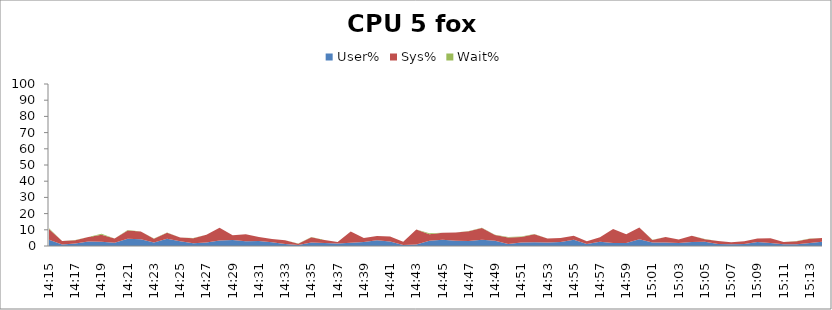
| Category | User% | Sys% | Wait% |
|---|---|---|---|
| 14:15 | 3.8 | 6.7 | 0.4 |
| 14:16 | 0.9 | 2.2 | 0 |
| 14:17 | 1.5 | 2.1 | 0.1 |
| 14:18 | 2.8 | 2.7 | 0 |
| 14:19 | 2.7 | 4.3 | 0.6 |
| 14:20 | 2 | 2.6 | 0 |
| 14:21 | 4.5 | 5.1 | 0.2 |
| 14:22 | 4.2 | 4.8 | 0 |
| 14:23 | 2.2 | 2.3 | 0.1 |
| 14:24 | 4.4 | 3.8 | 0.1 |
| 14:25 | 2.9 | 2.3 | 0.1 |
| 14:26 | 1.7 | 3.1 | 0.1 |
| 14:27 | 2.1 | 4.9 | 0 |
| 14:28 | 3.4 | 7.8 | 0 |
| 14:29 | 3.7 | 3 | 0 |
| 14:30 | 2.9 | 4.4 | 0 |
| 14:31 | 3.1 | 2.5 | 0 |
| 14:32 | 2.3 | 2 | 0 |
| 14:33 | 1.2 | 2.4 | 0 |
| 14:34 | 0.6 | 0.8 | 0.1 |
| 14:35 | 2.1 | 3.3 | 0.1 |
| 14:36 | 1.9 | 1.8 | 0 |
| 14:37 | 1.5 | 1 | 0 |
| 14:38 | 2 | 7 | 0 |
| 14:39 | 2.5 | 2.4 | 0 |
| 14:40 | 3.5 | 2.6 | 0 |
| 14:41 | 2.8 | 3.1 | 0 |
| 14:42 | 0.6 | 2.1 | 0 |
| 14:43 | 0.9 | 9.3 | 0 |
| 14:44 | 3.2 | 4 | 0.7 |
| 14:45 | 3.9 | 4.3 | 0 |
| 14:46 | 3.3 | 5 | 0 |
| 14:47 | 3.1 | 6 | 0.1 |
| 14:48 | 3.8 | 7.3 | 0.2 |
| 14:49 | 3.3 | 3.5 | 0.1 |
| 14:50 | 1.3 | 4 | 0.2 |
| 14:51 | 2.2 | 3.4 | 0.3 |
| 14:52 | 2.3 | 5 | 0.1 |
| 14:53 | 2.1 | 2.5 | 0.1 |
| 14:54 | 2.4 | 2.6 | 0 |
| 14:55 | 3.9 | 2.4 | 0.1 |
| 14:56 | 1.3 | 1.6 | 0 |
| 14:57 | 2.6 | 2.8 | 0 |
| 14:58 | 1.8 | 8.7 | 0 |
| 14:59 | 1.8 | 5.5 | 0 |
| 15:00 | 4.2 | 7.2 | 0 |
| 15:01 | 2.1 | 1.6 | 0.1 |
| 15:02 | 2.1 | 3.4 | 0.1 |
| 15:03 | 1.8 | 2.2 | 0 |
| 15:04 | 2.5 | 3.8 | 0.1 |
| 15:05 | 2.6 | 1.6 | 0.1 |
| 15:06 | 1.3 | 1.8 | 0 |
| 15:07 | 1.1 | 1.2 | 0 |
| 15:08 | 1.2 | 1.8 | 0 |
| 15:09 | 2.4 | 2.3 | 0 |
| 15:10 | 1.9 | 2.9 | 0 |
| 15:11 | 1.1 | 1.4 | 0 |
| 15:12 | 1.1 | 1.8 | 0.2 |
| 15:13 | 1.9 | 2.6 | 0.1 |
| 15:14 | 2.6 | 2.3 | 0 |